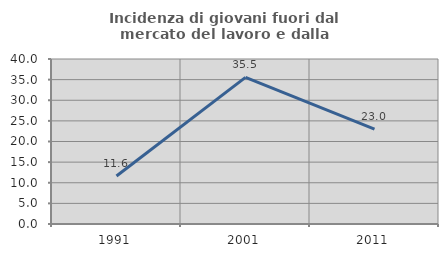
| Category | Incidenza di giovani fuori dal mercato del lavoro e dalla formazione  |
|---|---|
| 1991.0 | 11.631 |
| 2001.0 | 35.533 |
| 2011.0 | 23.015 |